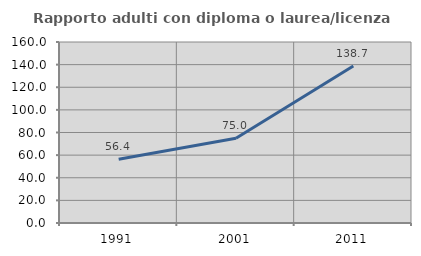
| Category | Rapporto adulti con diploma o laurea/licenza media  |
|---|---|
| 1991.0 | 56.436 |
| 2001.0 | 75 |
| 2011.0 | 138.722 |